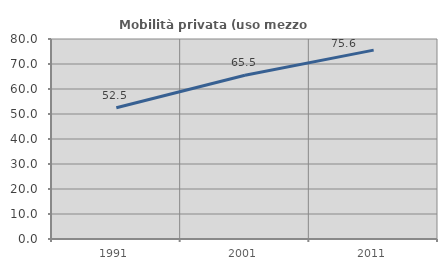
| Category | Mobilità privata (uso mezzo privato) |
|---|---|
| 1991.0 | 52.478 |
| 2001.0 | 65.493 |
| 2011.0 | 75.551 |